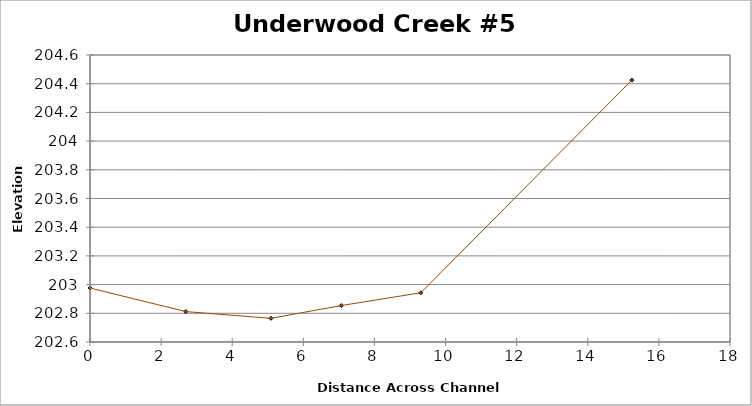
| Category | Series 0 |
|---|---|
| 0.0 | 202.976 |
| 2.694696458282937 | 202.812 |
| 5.090186735278479 | 202.765 |
| 7.067176239822389 | 202.854 |
| 9.302660802546772 | 202.943 |
| 15.240533127583008 | 204.425 |